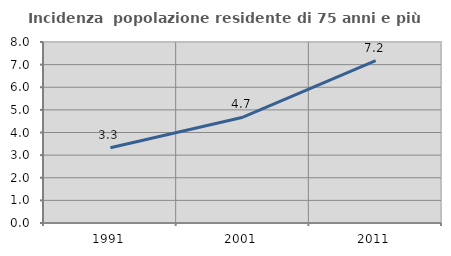
| Category | Incidenza  popolazione residente di 75 anni e più |
|---|---|
| 1991.0 | 3.325 |
| 2001.0 | 4.676 |
| 2011.0 | 7.173 |